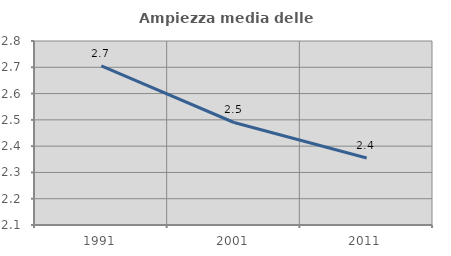
| Category | Ampiezza media delle famiglie |
|---|---|
| 1991.0 | 2.705 |
| 2001.0 | 2.49 |
| 2011.0 | 2.355 |